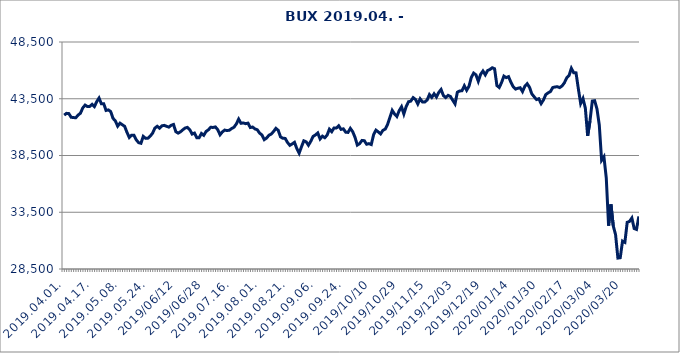
| Category | Series 0 |
|---|---|
| 2019.04.01. | 42057.333 |
| 2019.04.02. | 42213.346 |
| 2019.04.03. | 42193.967 |
| 2019.04.04. | 41870.438 |
| 2019.04.05. | 41841.921 |
| 2019.04.08. | 41826.902 |
| 2019.04.09. | 42063.939 |
| 2019.04.10. | 42225.867 |
| 2019.04.11. | 42693.515 |
| 2019.04.12. | 42940.74 |
| 2019.04.15. | 42815.922 |
| 2019.04.16. | 42826.299 |
| 2019.04.17. | 43004.506 |
| 2019.04.18. | 42810.106 |
| 2019.04.23. | 43245.434 |
| 2019.04.24. | 43563.383 |
| 2019.04.25. | 43053.87 |
| 2019.04.26. | 43064.395 |
| 2019.04.29. | 42469.842 |
| 2019.04.30. | 42520.113 |
| 2019.05.02. | 42366.822 |
| 2019.05.03. | 41775.362 |
| 2019.05.06. | 41547.348 |
| 2019.05.07. | 41084.566 |
| 2019.05.08. | 41350.332 |
| 2019.05.09. | 41207.462 |
| 2019.05.10. | 41068.206 |
| 2019.05.13. | 40537.85 |
| 2019.05.14. | 40084.639 |
| 2019.05.15. | 40291.354 |
| 2019.05.16. | 40288.281 |
| 2019.05.17. | 39877.816 |
| 2019.05.20. | 39630.707 |
| 2019.05.21. | 39575.984 |
| 2019.05.22. | 40184.851 |
| 2019.05.23. | 40010.724 |
| 2019.05.24. | 40022.617 |
| 2019.05.27. | 40207.91 |
| 2019.05.28. | 40466.853 |
| 2019.05.29. | 40916.417 |
| 2019.05.30. | 41075.874 |
| 2019.05.31. | 40904.115 |
| 2019.06.03 | 41114.306 |
| 2019.06.04 | 41157.018 |
| 2019.06.05 | 41073.621 |
| 2019.06.06 | 41000.038 |
| 2019.06.07 | 41159.574 |
| 2019.06.11 | 41234.66 |
| 2019.06.12 | 40592.319 |
| 2019.06.13 | 40469.802 |
| 2019.06.14 | 40588.176 |
| 2019.06.17 | 40764.495 |
| 2019.06.18 | 40922.407 |
| 2019.06.19 | 40980.241 |
| 2019.06.20 | 40774.518 |
| 2019.06.21 | 40387.214 |
| 2019.06.24 | 40475.093 |
| 2019.06.25 | 40061.951 |
| 2019.06.26 | 40064.921 |
| 2019.06.27 | 40440.51 |
| 2019.06.28 | 40279.313 |
| 2019.07.01. | 40618.076 |
| 2019.07.02. | 40767.118 |
| 2019.07.03. | 40985.185 |
| 2019.07.04. | 40972.916 |
| 2019.07.05. | 41016.647 |
| 2019.07.08. | 40777.084 |
| 2019.07.09. | 40327.449 |
| 2019.07.10. | 40577.793 |
| 2019.07.11. | 40739.423 |
| 2019.07.12. | 40699.692 |
| 2019.07.15. | 40725.399 |
| 2019.07.16. | 40878.783 |
| 2019.07.17. | 40990.895 |
| 2019.07.18. | 41282.464 |
| 2019.07.19. | 41707.259 |
| 2019.07.22. | 41338.015 |
| 2019.07.23. | 41367.219 |
| 2019.07.24. | 41303.37 |
| 2019.07.25. | 41353.622 |
| 2019.07.26. | 40965.481 |
| 2019.07.29. | 41006.442 |
| 2019.07.30. | 40843.781 |
| 2019.07.31. | 40767.602 |
| 2019.08.01. | 40474.269 |
| 2019.08.02. | 40309.612 |
| 2019.08.05. | 39896.309 |
| 2019.08.06. | 40037.387 |
| 2019.08.07. | 40283.521 |
| 2019.08.08. | 40389.377 |
| 2019.08.09. | 40615.424 |
| 2019.08.12. | 40891.991 |
| 2019.08.13. | 40722.358 |
| 2019.08.14. | 40137.225 |
| 2019.08.15. | 40018.668 |
| 2019.08.16. | 40005.898 |
| 2019.08.21. | 39648.209 |
| 2019.08.22. | 39394.712 |
| 2019.08.23. | 39519.583 |
| 2019.08.26. | 39661.467 |
| 2019.08.27. | 39107.942 |
| 2019.08.28. | 38706.562 |
| 2019.08.29. | 39264.477 |
| 2019.08.30. | 39794.118 |
| 2019.09.02. | 39707.431 |
| 2019.09.03. | 39405.191 |
| 2019.09.04. | 39753.487 |
| 2019.09.05. | 40180.897 |
| 2019.09.06. | 40312.464 |
| 2019.09.09. | 40484.755 |
| 2019.09.10. | 39956.962 |
| 2019.09.11. | 40202.606 |
| 2019.09.12. | 40066.952 |
| 2019.09.13. | 40285.207 |
| 2019.09.16. | 40819.558 |
| 2019.09.17. | 40596.706 |
| 2019.09.18. | 40930.237 |
| 2019.09.19. | 40922.304 |
| 2019.09.20. | 41116.917 |
| 2019.09.23. | 40800.213 |
| 2019.09.24. | 40848.044 |
| 2019.09.25. | 40553.924 |
| 2019.09.26. | 40534.279 |
| 2019.09.27. | 40890.738 |
| 2019.09.30. | 40601.183 |
| 2019.10.01 | 40112.384 |
| 2019.10.02 | 39416.768 |
| 2019.10.03 | 39547.586 |
| 2019.10.04 | 39826.507 |
| 2019.10.07 | 39803.958 |
| 2019.10.08 | 39491.525 |
| 2019.10.09 | 39544.616 |
| 2019.10.10 | 39466.345 |
| 2019.10.11 | 40332.557 |
| 2019.10.14 | 40733.7 |
| 2019.10.15 | 40578.176 |
| 2019.10.16 | 40404.658 |
| 2019.10.17 | 40717.165 |
| 2019.10.18 | 40826.334 |
| 2019.10.21 | 41234.577 |
| 2019.10.22 | 41845.949 |
| 2019.10.24 | 42475.528 |
| 2019.10.25 | 42159.364 |
| 2019.10.28 | 41938.536 |
| 2019.10.29 | 42453.163 |
| 2019.10.30 | 42796.697 |
| 2019.10.31 | 42159.577 |
| 2019.11.04 | 42817.548 |
| 2019.11.05 | 43236.798 |
| 2019.11.06 | 43291.612 |
| 2019.11.07 | 43598.194 |
| 2019.11.08 | 43441.421 |
| 2019.11.11 | 43038.673 |
| 2019.11.12 | 43492.327 |
| 2019.11.13 | 43216.342 |
| 2019.11.14 | 43218.284 |
| 2019.11.15 | 43384.63 |
| 2019.11.18 | 43867.734 |
| 2019.11.19 | 43618.781 |
| 2019.11.20 | 43938.904 |
| 2019.11.21 | 43654.367 |
| 2019.11.22 | 44053.952 |
| 2019.11.25 | 44314.452 |
| 2019.11.26 | 43781.964 |
| 2019.11.27 | 43599.69 |
| 2019.11.28 | 43799.845 |
| 2019.11.29 | 43704.855 |
| 2019.12.02 | 43370.304 |
| 2019.12.03 | 43048.249 |
| 2019.12.04 | 44078.023 |
| 2019.12.05 | 44182.067 |
| 2019.12.06 | 44207.495 |
| 2019.12.09 | 44640.377 |
| 2019.12.10 | 44248.517 |
| 2019.12.11 | 44603.481 |
| 2019.12.12 | 45382.68 |
| 2019.12.13 | 45760.147 |
| 2019.12.16 | 45603.921 |
| 2019.12.17 | 45035.353 |
| 2019.12.18 | 45656.797 |
| 2019.12.19 | 45944.683 |
| 2019.12.20 | 45606.347 |
| 2019.12.23 | 45984.456 |
| 2019.12.30 | 46082.821 |
| 2020.01.02 | 46230.218 |
| 2020.01.03 | 46141.224 |
| 2020.01.06 | 44658.759 |
| 2020.01.07 | 44490.798 |
| 2020.01.08 | 44932.181 |
| 2020.01.09 | 45493.151 |
| 2020.01.10 | 45364.138 |
| 2020.01.13 | 45447.517 |
| 2020.01.14 | 44960.314 |
| 2020.01.15 | 44565.031 |
| 2020.01.16 | 44350.395 |
| 2020.01.17 | 44422.806 |
| 2020.01.20 | 44470.931 |
| 2020.01.21 | 44132.002 |
| 2020.01.22 | 44597.049 |
| 2020.01.23 | 44823.279 |
| 2020.01.24 | 44515.972 |
| 2020.01.27 | 43929.169 |
| 2020.01.28 | 43675.499 |
| 2020.01.29 | 43431.302 |
| 2020.01.30 | 43501.994 |
| 2020.01.31 | 43072.078 |
| 2020.02.03 | 43390.814 |
| 2020.02.04 | 43864.824 |
| 2020.02.05 | 44020.034 |
| 2020.02.06 | 44127.992 |
| 2020.02.07 | 44486.916 |
| 2020.02.10 | 44538.585 |
| 2020.02.11 | 44559.949 |
| 2020.02.12 | 44482.404 |
| 2020.02.13 | 44629.506 |
| 2020.02.14 | 44905.976 |
| 2020.02.17 | 45338.261 |
| 2020.02.18 | 45547.151 |
| 2020.02.19 | 46182.092 |
| 2020.02.20 | 45792.074 |
| 2020.02.21 | 45781.353 |
| 2020.02.24 | 44381.316 |
| 2020.02.25 | 43075.074 |
| 2020.02.26 | 43521.906 |
| 2020.02.27 | 42679.399 |
| 2020.02.28 | 40229.643 |
| 2020.03.02 | 41537.199 |
| 2020.03.03 | 43301.386 |
| 2020.03.04 | 43327.916 |
| 2020.03.05 | 42607.975 |
| 2020.03.06 | 41185.289 |
| 2020.03.09 | 38075.829 |
| 2020.03.10 | 38380.597 |
| 2020.03.11 | 36536.239 |
| 2020.03.12 | 32317.889 |
| 2020.03.13 | 34189.086 |
| 2020.03.16 | 32304.48 |
| 2020.03.17 | 31525.597 |
| 2020.03.18 | 29464.278 |
| 2020.03.19 | 29494.191 |
| 2020.03.20 | 30959.94 |
| 2020.03.23 | 30848.561 |
| 2020.03.24 | 32614.556 |
| 2020.03.25 | 32690.449 |
| 2020.03.26 | 32994.297 |
| 2020.03.27 | 32065.139 |
| 2020.03.30 | 31985.326 |
| 2020.03.31 | 33134.867 |